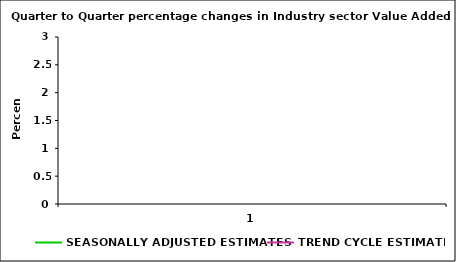
| Category | SEASONALLY ADJUSTED ESTIMATES | TREND CYCLE ESTIMATES |
|---|---|---|
| 0 | 2.694 | 1.781 |